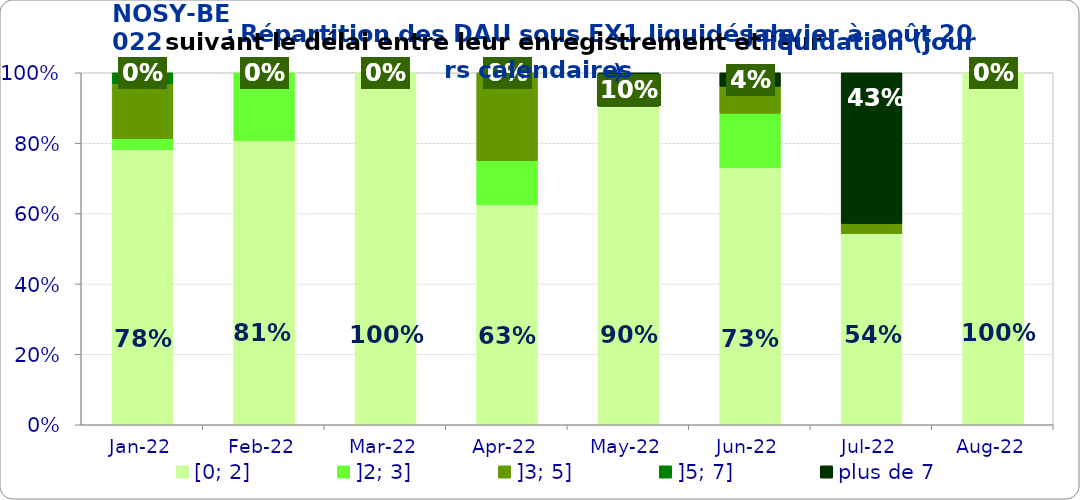
| Category | [0; 2] | ]2; 3] | ]3; 5] | ]5; 7] | plus de 7 |
|---|---|---|---|---|---|
| 2022-01-01 | 0.781 | 0.031 | 0.156 | 0.031 | 0 |
| 2022-02-01 | 0.808 | 0.192 | 0 | 0 | 0 |
| 2022-03-01 | 1 | 0 | 0 | 0 | 0 |
| 2022-04-01 | 0.625 | 0.125 | 0.25 | 0 | 0 |
| 2022-05-01 | 0.905 | 0 | 0 | 0 | 0.095 |
| 2022-06-01 | 0.731 | 0.154 | 0.077 | 0 | 0.038 |
| 2022-07-01 | 0.543 | 0 | 0.029 | 0 | 0.429 |
| 2022-08-01 | 1 | 0 | 0 | 0 | 0 |